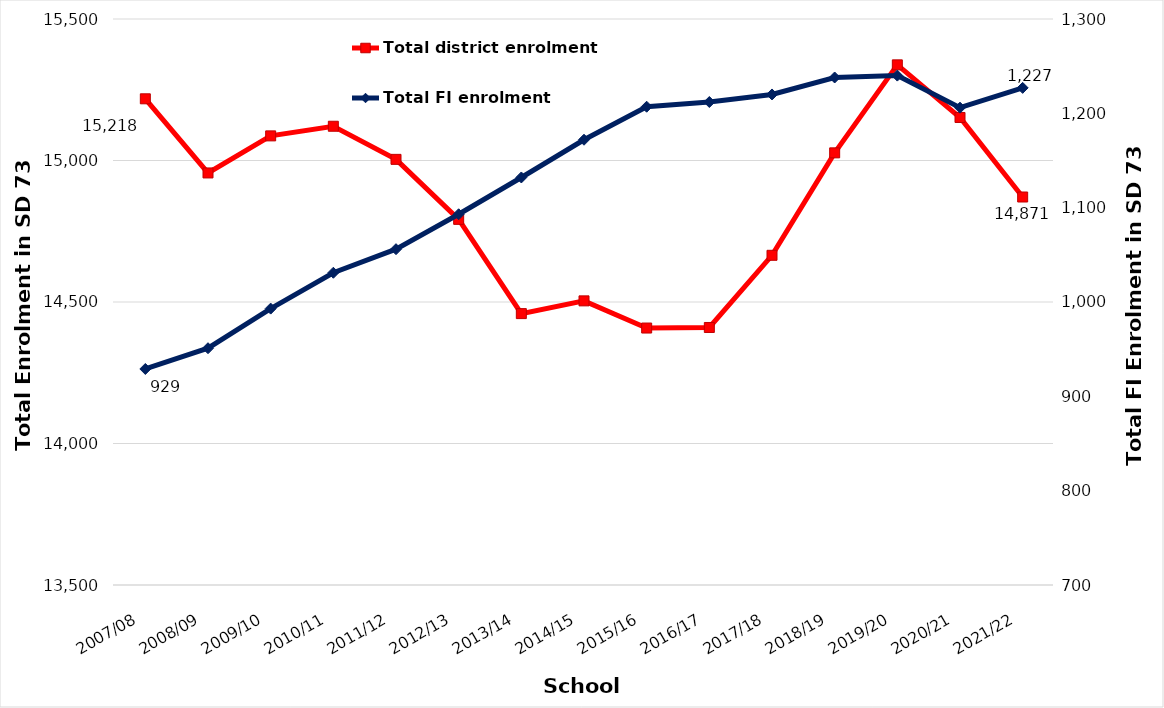
| Category | Total district enrolment  |
|---|---|
| 2007/08 | 15218 |
| 2008/09 | 14956 |
| 2009/10 | 15087 |
| 2010/11 | 15121 |
| 2011/12 | 15004 |
| 2012/13 | 14792 |
| 2013/14 | 14459 |
| 2014/15 | 14504 |
| 2015/16 | 14408 |
| 2016/17 | 14410 |
| 2017/18 | 14665 |
| 2018/19 | 15027 |
| 2019/20 | 15338 |
| 2020/21 | 15152 |
| 2021/22 | 14871 |